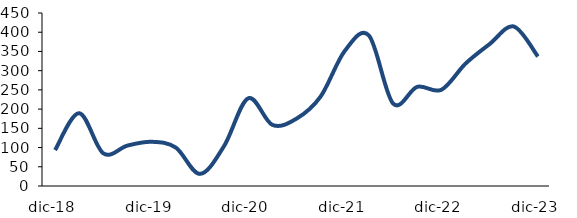
| Category | Series 0 |
|---|---|
| 2018-12-01 | 93.451 |
| 2019-03-01 | 189.323 |
| 2019-06-01 | 84.899 |
| 2019-09-01 | 105.151 |
| 2019-12-01 | 114.976 |
| 2020-03-01 | 99.973 |
| 2020-06-01 | 31.503 |
| 2020-09-01 | 103.901 |
| 2020-12-01 | 228.153 |
| 2021-03-01 | 159.024 |
| 2021-06-01 | 175.211 |
| 2021-09-01 | 232.848 |
| 2021-12-01 | 351.453 |
| 2022-03-01 | 391.415 |
| 2022-06-01 | 214.581 |
| 2022-09-01 | 257.895 |
| 2022-12-01 | 250.243 |
| 2023-03-01 | 318.284 |
| 2023-06-01 | 369.23 |
| 2023-09-01 | 414.847 |
| 2023-12-01 | 336.76 |